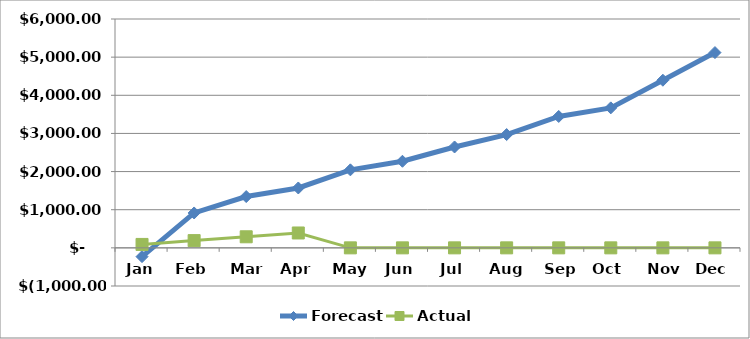
| Category | Forecast | Actual |
|---|---|---|
| Jan | -230 | 90.01 |
| Feb | 915 | 190.01 |
| Mar | 1345 | 290.01 |
| Apr | 1570 | 390.01 |
| May | 2045 | 0 |
| Jun | 2270 | 0 |
| Jul | 2645 | 0 |
| Aug | 2970 | 0 |
| Sep | 3445 | 0 |
| Oct | 3670 | 0 |
| Nov | 4395 | 0 |
| Dec | 5120 | 0 |